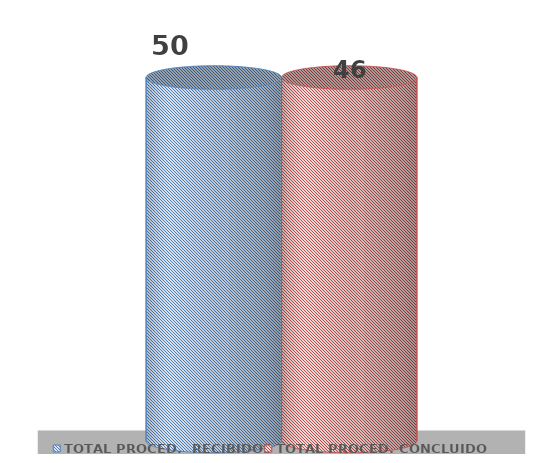
| Category | TOTAL PROCED.  RECIBIDOS | TOTAL PROCED. CONCLUIDOS |
|---|---|---|
| 0 | 50 | 46 |